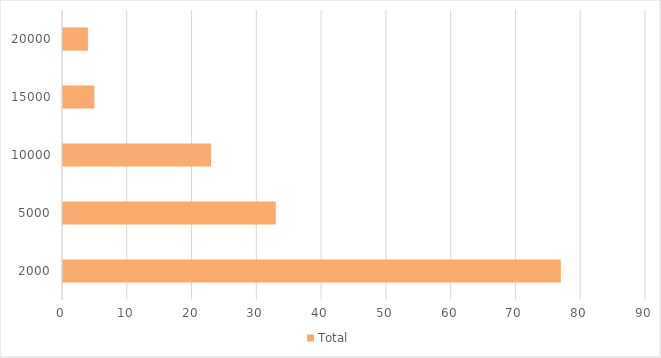
| Category | Total |
|---|---|
| 2000.0 | 77 |
| 5000.0 | 33 |
| 10000.0 | 23 |
| 15000.0 | 5 |
| 20000.0 | 4 |